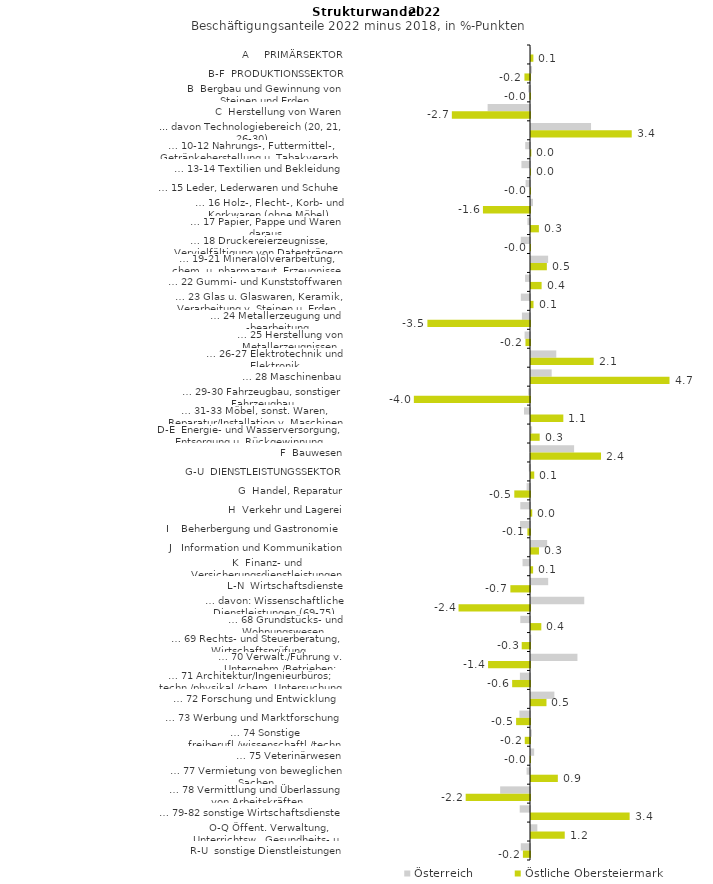
| Category | Österreich | Östliche Obersteiermark |
|---|---|---|
| A     PRIMÄRSEKTOR | 0.004 | 0.081 |
| B-F  PRODUKTIONSSEKTOR | 0.036 | -0.19 |
| B  Bergbau und Gewinnung von Steinen und Erden | -0.063 | -0.018 |
| C  Herstellung von Waren | -1.445 | -2.664 |
| ... davon Technologiebereich (20, 21, 26-30) | 2.047 | 3.434 |
| … 10-12 Nahrungs-, Futtermittel-, Getränkeherstellung u. Tabakverarb. | -0.163 | 0.011 |
| … 13-14 Textilien und Bekleidung | -0.292 | 0 |
| … 15 Leder, Lederwaren und Schuhe | -0.15 | -0.005 |
| … 16 Holz-, Flecht-, Korb- und Korkwaren (ohne Möbel)  | 0.068 | -1.604 |
| … 17 Papier, Pappe und Waren daraus  | -0.09 | 0.269 |
| … 18 Druckereierzeugnisse, Vervielfältigung von Datenträgern | -0.314 | -0.007 |
| … 19-21 Mineralölverarbeitung, chem. u. pharmazeut. Erzeugnisse | 0.584 | 0.54 |
| … 22 Gummi- und Kunststoffwaren | -0.168 | 0.362 |
| … 23 Glas u. Glaswaren, Keramik, Verarbeitung v. Steinen u. Erden  | -0.312 | 0.086 |
| … 24 Metallerzeugung und -bearbeitung | -0.276 | -3.498 |
| … 25 Herstellung von Metallerzeugnissen  | -0.185 | -0.154 |
| … 26-27 Elektrotechnik und Elektronik | 0.862 | 2.136 |
| … 28 Maschinenbau | 0.705 | 4.722 |
| … 29-30 Fahrzeugbau, sonstiger Fahrzeugbau | -0.066 | -3.959 |
| … 31-33 Möbel, sonst. Waren, Reparatur/Installation v. Maschinen | -0.204 | 1.102 |
| D-E  Energie- und Wasserversorgung, Entsorgung u. Rückgewinnung | 0.038 | 0.296 |
| F  Bauwesen | 1.469 | 2.387 |
| G-U  DIENSTLEISTUNGSSEKTOR | -0.04 | 0.111 |
| G  Handel, Reparatur | -0.115 | -0.535 |
| H  Verkehr und Lagerei | -0.33 | 0.042 |
| I    Beherbergung und Gastronomie | -0.34 | -0.089 |
| J   Information und Kommunikation | 0.551 | 0.272 |
| K  Finanz- und Versicherungsdienstleistungen | -0.255 | 0.072 |
| L-N  Wirtschaftsdienste | 0.586 | -0.669 |
| … davon: Wissenschaftliche Dienstleistungen (69-75) | 1.815 | -2.436 |
| … 68 Grundstücks- und Wohnungswesen  | -0.331 | 0.351 |
| … 69 Rechts- und Steuerberatung, Wirtschaftsprüfung | 0.008 | -0.282 |
| … 70 Verwalt./Führung v. Unternehm./Betrieben; Unternehmensberat. | 1.583 | -1.43 |
| … 71 Architektur/Ingenieurbüros; techn./physikal./chem. Untersuchung | -0.344 | -0.608 |
| … 72 Forschung und Entwicklung  | 0.797 | 0.528 |
| … 73 Werbung und Marktforschung | -0.361 | -0.474 |
| … 74 Sonstige freiberufl./wissenschaftl./techn. Tätigkeiten | 0.025 | -0.178 |
| … 75 Veterinärwesen | 0.108 | -0.01 |
| … 77 Vermietung von beweglichen Sachen  | -0.116 | 0.915 |
| … 78 Vermittlung und Überlassung von Arbeitskräften | -1.018 | -2.192 |
| … 79-82 sonstige Wirtschaftsdienste | -0.351 | 3.362 |
| O-Q Öffent. Verwaltung, Unterrichtsw., Gesundheits- u. Sozialwesen | 0.216 | 1.15 |
| R-U  sonstige Dienstleistungen | -0.314 | -0.242 |